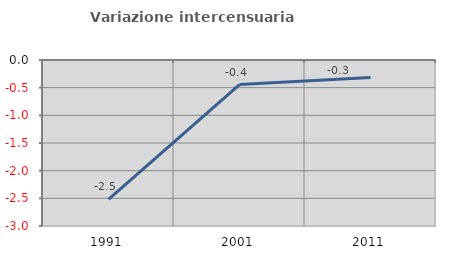
| Category | Variazione intercensuaria annua |
|---|---|
| 1991.0 | -2.52 |
| 2001.0 | -0.444 |
| 2011.0 | -0.317 |